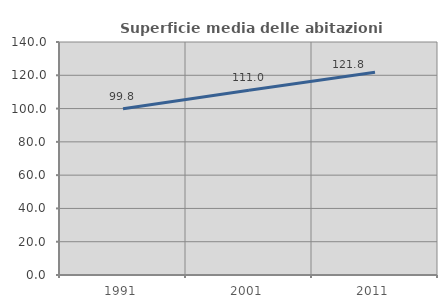
| Category | Superficie media delle abitazioni occupate |
|---|---|
| 1991.0 | 99.847 |
| 2001.0 | 110.992 |
| 2011.0 | 121.809 |